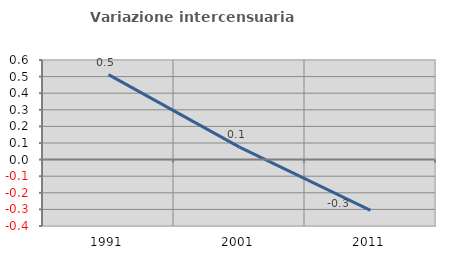
| Category | Variazione intercensuaria annua |
|---|---|
| 1991.0 | 0.512 |
| 2001.0 | 0.075 |
| 2011.0 | -0.306 |